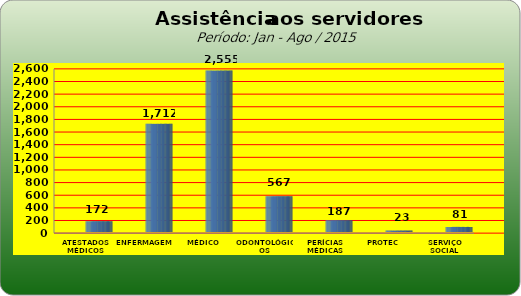
| Category | Series 0 |
|---|---|
| ATESTADOS MÉDICOS | 172 |
| ENFERMAGEM | 1712 |
| MÉDICO | 2555 |
| ODONTOLÓGICOS | 567 |
| PERÍCIAS MÉDICAS | 187 |
| PROTEC | 23 |
| SERVIÇO SOCIAL | 81 |